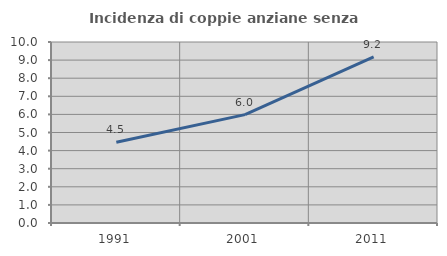
| Category | Incidenza di coppie anziane senza figli  |
|---|---|
| 1991.0 | 4.459 |
| 2001.0 | 5.987 |
| 2011.0 | 9.18 |